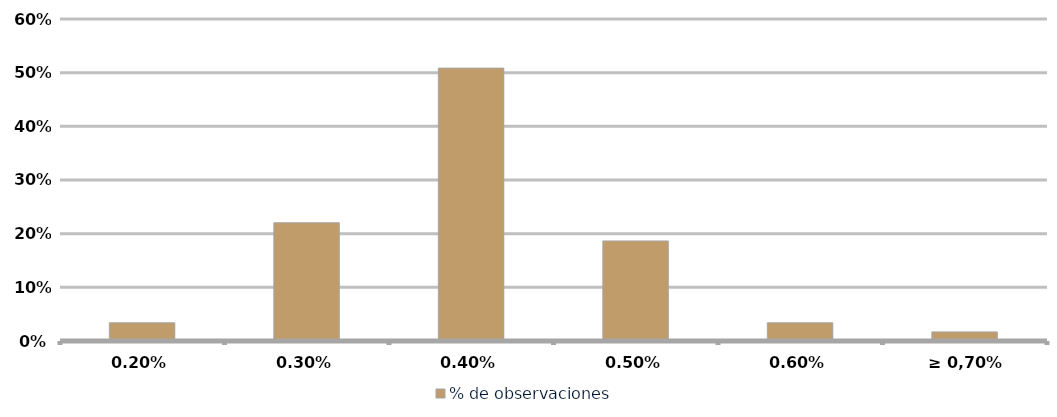
| Category | % de observaciones  |
|---|---|
| 0,20% | 0.034 |
| 0,30% | 0.22 |
| 0,40% | 0.508 |
| 0,50% | 0.186 |
| 0,60% | 0.034 |
| ≥ 0,70% | 0.017 |